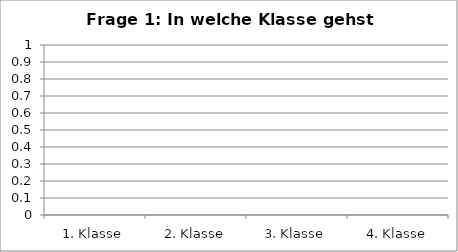
| Category | Series 0 |
|---|---|
| 1. Klasse | 0 |
| 2. Klasse | 0 |
| 3. Klasse | 0 |
| 4. Klasse | 0 |